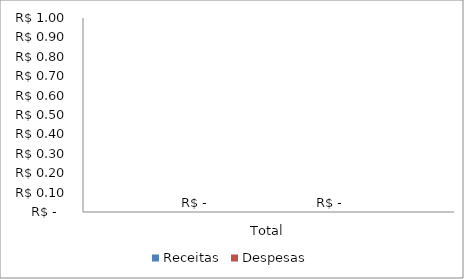
| Category | Receitas | Despesas |
|---|---|---|
| Total | 0 | 0 |